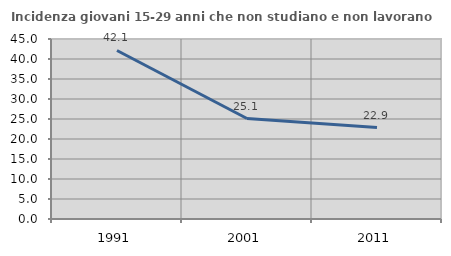
| Category | Incidenza giovani 15-29 anni che non studiano e non lavorano  |
|---|---|
| 1991.0 | 42.132 |
| 2001.0 | 25.121 |
| 2011.0 | 22.857 |